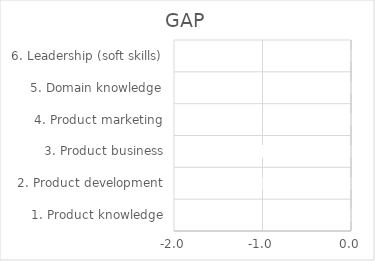
| Category | GAP |
|---|---|
| 1. Product knowledge | -0.667 |
| 2. Product development | -1 |
| 3. Product business | -1.2 |
| 4. Product marketing | -0.4 |
| 5. Domain knowledge | -0.2 |
| 6. Leadership (soft skills) | -0.6 |